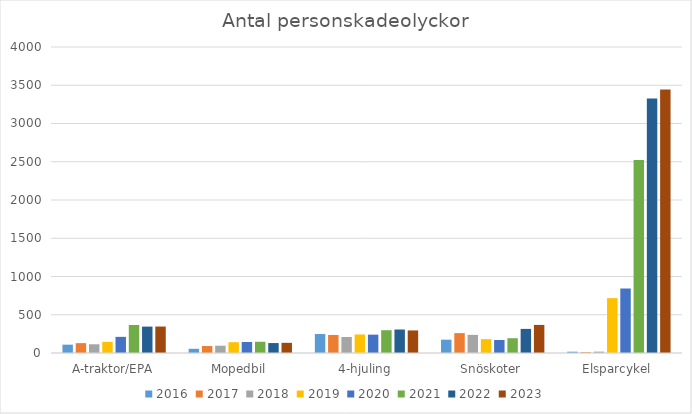
| Category | 2016 | 2017 | 2018 | 2019 | 2020 | 2021 | 2022 | 2023 |
|---|---|---|---|---|---|---|---|---|
| A-traktor/EPA | 109 | 129 | 114 | 146 | 211 | 366 | 345 | 346 |
| Mopedbil | 55 | 91 | 95 | 141 | 144 | 147 | 130 | 133 |
| 4-hjuling | 248 | 236 | 209 | 242 | 240 | 298 | 307 | 295 |
| Snöskoter | 174 | 260 | 237 | 181 | 170 | 193 | 315 | 367 |
| Elsparcykel | 17 | 10 | 18 | 717 | 843 | 2523 | 3326 | 3444 |